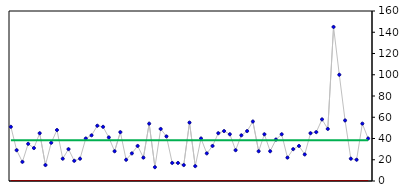
| Category | My Output | UCL | LCL | Mean |
|---|---|---|---|---|
| 0 | 13 | 88.531 | -12.595 | 37.968 |
| 1 | 48 | 88.531 | -12.595 | 37.968 |
| 2 | 12 | 88.531 | -12.595 | 37.968 |
| 3 | 13 | 88.531 | -12.595 | 37.968 |
| 4 | 25 | 88.531 | -12.595 | 37.968 |
| 5 | 100 | 88.531 | -12.595 | 37.968 |
| 6 | 145 | 88.531 | -12.595 | 37.968 |
| 7 | 19 | 88.531 | -12.595 | 37.968 |
| 8 | 36 | 88.531 | -12.595 | 37.968 |
| 9 | 34 | 88.531 | -12.595 | 37.968 |
| 10 | 37 | 88.531 | -12.595 | 37.968 |
| 11 | 13 | 88.531 | -12.595 | 37.968 |
| 12 | 36 | 88.531 | -12.595 | 37.968 |
| 13 | 34 | 88.531 | -12.595 | 37.968 |
| 14 | 57 | 88.531 | -12.595 | 37.968 |
| 15 | 42 | 88.531 | -12.595 | 37.968 |
| 16 | 25 | 88.531 | -12.595 | 37.968 |
| 17 | 41 | 88.531 | -12.595 | 37.968 |
| 18 | 26 | 88.531 | -12.595 | 37.968 |
| 19 | 22 | 88.531 | -12.595 | 37.968 |
| 20 | 56 | 88.531 | -12.595 | 37.968 |
| 21 | 52 | 88.531 | -12.595 | 37.968 |
| 22 | 52 | 88.531 | -12.595 | 37.968 |
| 23 | 31 | 88.531 | -12.595 | 37.968 |
| 24 | 51 | 88.531 | -12.595 | 37.968 |
| 25 | 26 | 88.531 | -12.595 | 37.968 |
| 26 | 56 | 88.531 | -12.595 | 37.968 |
| 27 | 14 | 88.531 | -12.595 | 37.968 |
| 28 | 40 | 88.531 | -12.595 | 37.968 |
| 29 | 53 | 88.531 | -12.595 | 37.968 |
| 30 | 29 | 88.531 | -12.595 | 37.968 |
| 31 | 53 | 88.531 | -12.595 | 37.968 |
| 32 | 41 | 88.531 | -12.595 | 37.968 |
| 33 | 12 | 88.531 | -12.595 | 37.968 |
| 34 | 34 | 88.531 | -12.595 | 37.968 |
| 35 | 27 | 88.531 | -12.595 | 37.968 |
| 36 | 22 | 88.531 | -12.595 | 37.968 |
| 37 | 30 | 88.531 | -12.595 | 37.968 |
| 38 | 17 | 88.531 | -12.595 | 37.968 |
| 39 | 17 | 88.531 | -12.595 | 37.968 |
| 40 | 51 | 88.531 | -12.595 | 37.968 |
| 41 | 16 | 88.531 | -12.595 | 37.968 |
| 42 | 47 | 88.531 | -12.595 | 37.968 |
| 43 | 34 | 88.531 | -12.595 | 37.968 |
| 44 | 58 | 88.531 | -12.595 | 37.968 |
| 45 | 59 | 88.531 | -12.595 | 37.968 |
| 46 | 55 | 88.531 | -12.595 | 37.968 |
| 47 | 49 | 88.531 | -12.595 | 37.968 |
| 48 | 47 | 88.531 | -12.595 | 37.968 |
| 49 | 57 | 88.531 | -12.595 | 37.968 |
| 50 | 15 | 88.531 | -12.595 | 37.968 |
| 51 | 36 | 88.531 | -12.595 | 37.968 |
| 52 | 37 | 88.531 | -12.595 | 37.968 |
| 53 | 28 | 88.531 | -12.595 | 37.968 |
| 54 | 28 | 88.531 | -12.595 | 37.968 |
| 55 | 22 | 88.531 | -12.595 | 37.968 |
| 56 | 45 | 88.531 | -12.595 | 37.968 |
| 57 | 38 | 88.531 | -12.595 | 37.968 |
| 58 | 29 | 88.531 | -12.595 | 37.968 |
| 59 | 28 | 88.531 | -12.595 | 37.968 |
| 60 | 25 | 88.531 | -12.595 | 37.968 |
| 61 | 51 | 88.531 | -12.595 | 37.968 |
| 62 | 46 | 88.531 | -12.595 | 37.968 |